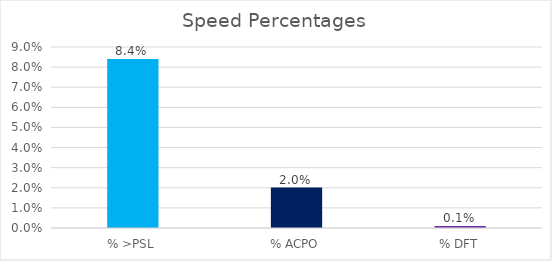
| Category | Series 0 |
|---|---|
| % >PSL | 0.084 |
| % ACPO | 0.02 |
| % DFT | 0.001 |